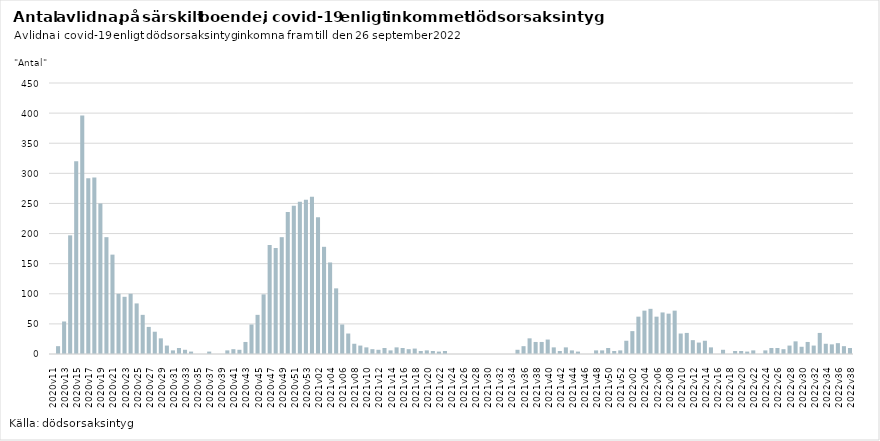
| Category | Series 0 |
|---|---|
| 2020v11 | 0 |
| 2020v12 | 13 |
| 2020v13 | 54 |
| 2020v14 | 197 |
| 2020v15 | 320 |
| 2020v16 | 396 |
| 2020v17 | 292 |
| 2020v18 | 293 |
| 2020v19 | 250 |
| 2020v20 | 194 |
| 2020v21 | 165 |
| 2020v22 | 100 |
| 2020v23 | 95 |
| 2020v24 | 100 |
| 2020v25 | 84 |
| 2020v26 | 65 |
| 2020v27 | 45 |
| 2020v28 | 37 |
| 2020v29 | 26 |
| 2020v30 | 14 |
| 2020v31 | 6 |
| 2020v32 | 10 |
| 2020v33 | 7 |
| 2020v34 | 4 |
| 2020v35 | 0 |
| 2020v36 | 0 |
| 2020v37 | 4 |
| 2020v38 | 0 |
| 2020v39 | 0 |
| 2020v40 | 6 |
| 2020v41 | 8 |
| 2020v42 | 7 |
| 2020v43 | 20 |
| 2020v44 | 49 |
| 2020v45 | 65 |
| 2020v46 | 99 |
| 2020v47 | 181 |
| 2020v48 | 176 |
| 2020v49 | 194 |
| 2020v50 | 236 |
| 2020v51 | 246 |
| 2020v52 | 253 |
| 2020v53 | 256 |
| 2021v01 | 261 |
| 2021v02 | 227 |
| 2021v03 | 178 |
| 2021v04 | 152 |
| 2021v05 | 109 |
| 2021v06 | 49 |
| 2021v07 | 34 |
| 2021v08 | 17 |
| 2021v09 | 14 |
| 2021v10 | 11 |
| 2021v11 | 8 |
| 2021v12 | 7 |
| 2021v13 | 10 |
| 2021v14 | 6 |
| 2021v15 | 11 |
| 2021v16 | 10 |
| 2021v17 | 8 |
| 2021v18 | 9 |
| 2021v19 | 5 |
| 2021v20 | 6 |
| 2021v21 | 5 |
| 2021v22 | 4 |
| 2021v23 | 5 |
| 2021v24 | 0 |
| 2021v25 | 0 |
| 2021v26 | 0 |
| 2021v27 | 0 |
| 2021v28 | 0 |
| 2021v29 | 0 |
| 2021v30 | 0 |
| 2021v31 | 0 |
| 2021v32 | 0 |
| 2021v33 | 0 |
| 2021v34 | 0 |
| 2021v35 | 7 |
| 2021v36 | 13 |
| 2021v37 | 26 |
| 2021v38 | 20 |
| 2021v39 | 20 |
| 2021v40 | 24 |
| 2021v41 | 11 |
| 2021v42 | 5 |
| 2021v43 | 11 |
| 2021v44 | 6 |
| 2021v45 | 4 |
| 2021v46 | 0 |
| 2021v47 | 0 |
| 2021v48 | 6 |
| 2021v49 | 6 |
| 2021v50 | 10 |
| 2021v51 | 5 |
| 2021v52 | 6 |
| 2022v01 | 22 |
| 2022v02 | 38 |
| 2022v03 | 62 |
| 2022v04 | 72 |
| 2022v05 | 75 |
| 2022v06 | 62 |
| 2022v07 | 69 |
| 2022v08 | 67 |
| 2022v09 | 72 |
| 2022v10 | 34 |
| 2022v11 | 35 |
| 2022v12 | 23 |
| 2022v13 | 19 |
| 2022v14 | 22 |
| 2022v15 | 11 |
| 2022v16 | 0 |
| 2022v17 | 7 |
| 2022v18 | 0 |
| 2022v19 | 5 |
| 2022v20 | 5 |
| 2022v21 | 4 |
| 2022v22 | 6 |
| 2022v23 | 0 |
| 2022v24 | 6 |
| 2022v25 | 10 |
| 2022v26 | 10 |
| 2022v27 | 8 |
| 2022v28 | 14 |
| 2022v29 | 21 |
| 2022v30 | 12 |
| 2022v31 | 20 |
| 2022v32 | 14 |
| 2022v33 | 35 |
| 2022v34 | 17 |
| 2022v35 | 16 |
| 2022v36 | 18 |
| 2022v37 | 13 |
| 2022v38 | 10 |